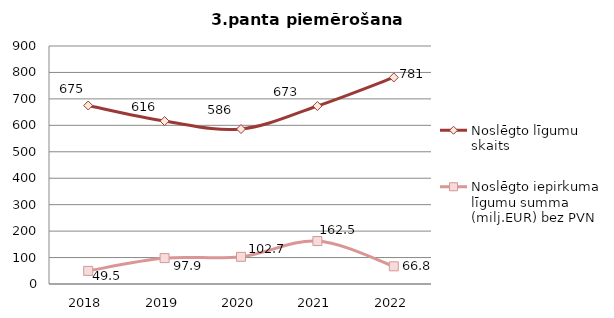
| Category | Noslēgto līgumu skaits | Noslēgto iepirkuma līgumu summa (milj.EUR) bez PVN |
|---|---|---|
| 2018.0 | 675 | 49.536 |
| 2019.0 | 616 | 97.928 |
| 2020.0 | 586 | 102.745 |
| 2021.0 | 673 | 162.472 |
| 2022.0 | 781 | 66.849 |